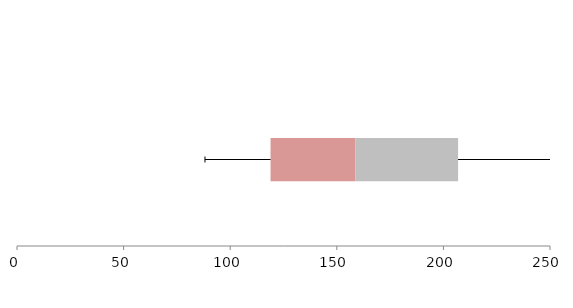
| Category | Series 1 | Series 2 | Series 3 |
|---|---|---|---|
| 0 | 118.923 | 39.835 | 48.13 |